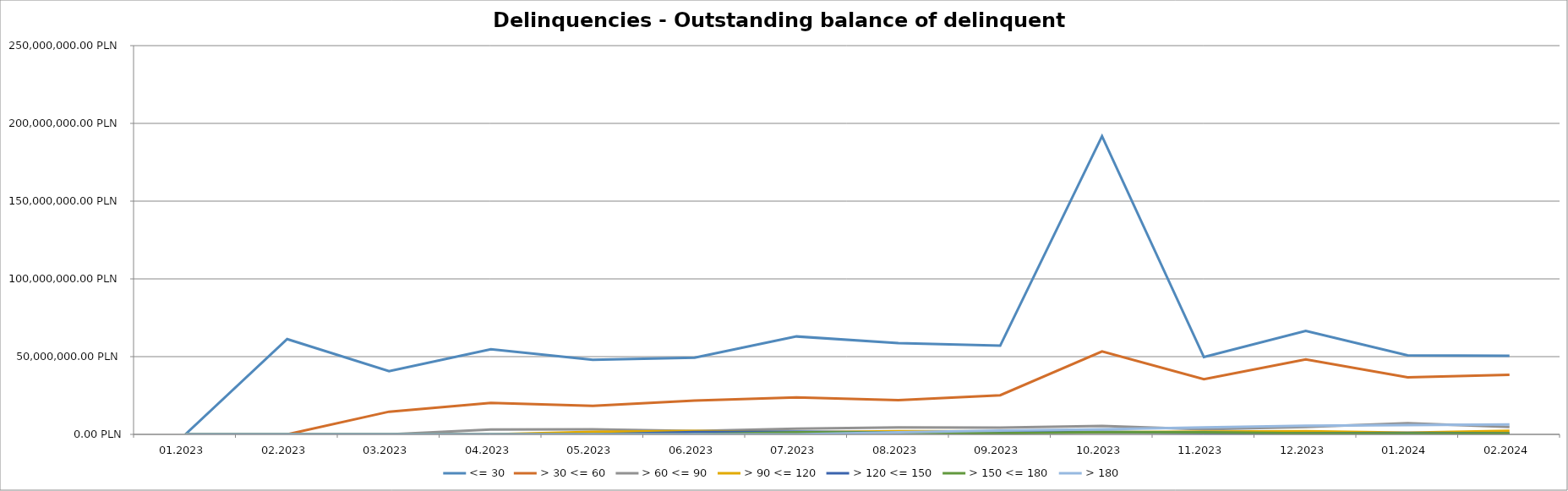
| Category | <= 30 | > 30 <= 60 | > 60 <= 90 | > 90 <= 120 | > 120 <= 150 | > 150 <= 180 | > 180 |
|---|---|---|---|---|---|---|---|
| 01.2023 | 0 | 0 | 0 | 0 | 0 | 0 | 0 |
| 02.2023 | 61279332.52 | 0 | 0 | 0 | 0 | 0 | 0 |
| 03.2023 | 40663789.15 | 14592814.21 | 0 | 0 | 0 | 0 | 0 |
| 04.2023 | 54729258.98 | 20207986.71 | 3105470.81 | 0 | 0 | 0 | 0 |
| 05.2023 | 47980491.52 | 18365026.23 | 3236930.39 | 1575049.71 | 0 | 0 | 0 |
| 06.2023 | 49274463.43 | 21757116.33 | 2145346.9 | 2234258.08 | 1546159.58 | 0 | 0 |
| 07.2023 | 62971390.96 | 23765504.45 | 3638339.96 | 1315739.52 | 1741228.92 | 1367122.32 | 0 |
| 08.2023 | 58667444.31 | 21958530.42 | 4534282.61 | 1998402.31 | 1197894.69 | 1186456.03 | 1367122.32 |
| 09.2023 | 57013090.09 | 25164417.49 | 4339269.75 | 1883194.82 | 1723494.5 | 705526.9 | 2508053.04 |
| 10.2023 | 191776280.48 | 53378945.55 | 5393392.38 | 1354505.77 | 1667300.89 | 1446484.43 | 3213579.94 |
| 11.2023 | 49723312.18 | 35482092.6 | 3276474.02 | 1813628.1 | 960023.75 | 1340003.09 | 4479480.65 |
| 12.2023 | 66557683.94 | 48283270.27 | 4762291.3 | 2048088.54 | 703260.31 | 730995.54 | 5619137.42 |
| 01.2024 | 50804141.07 | 36744266.23 | 7177545.74 | 1129913.48 | 940419.11 | 657491.3 | 5911358.03 |
| 02.2024 | 50502575.43 | 38257782.01 | 4690720.62 | 2248822.5 | 663999.75 | 739908.68 | 6397771.79 |